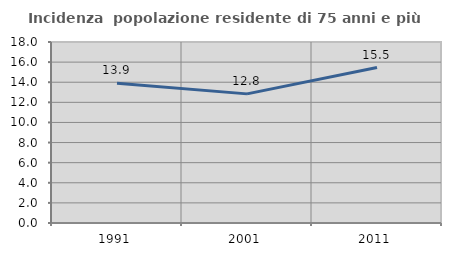
| Category | Incidenza  popolazione residente di 75 anni e più |
|---|---|
| 1991.0 | 13.896 |
| 2001.0 | 12.842 |
| 2011.0 | 15.461 |